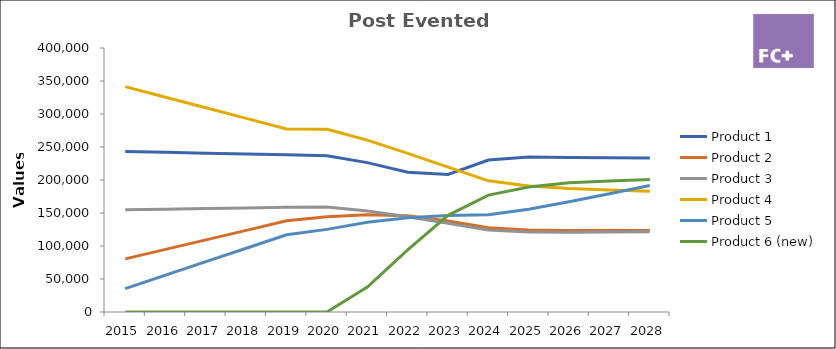
| Category | Product 1 | Product 2 | Product 3 | Product 4 | Product 5 | Product 6 (new) |
|---|---|---|---|---|---|---|
| 2015.0 | 243125 | 80451 | 154784 | 341524 | 35485 | 0 |
| 2016.0 | 241864 | 94875 | 155748 | 325475 | 55874 | 0 |
| 2017.0 | 240603 | 109299 | 156712 | 309426 | 76263 | 0 |
| 2018.0 | 239342 | 123723 | 157676 | 293377 | 96652 | 0 |
| 2019.0 | 238081 | 138147 | 158640 | 277328 | 117041 | 0 |
| 2020.0 | 236820 | 144330.058 | 159020.736 | 277003.434 | 125196.6 | 0 |
| 2021.0 | 226306.68 | 147514.199 | 153141.356 | 260367.682 | 135949.636 | 37747.352 |
| 2022.0 | 211791.047 | 145786.176 | 144435.813 | 240287.728 | 142658.713 | 94044.303 |
| 2023.0 | 208298.095 | 137939.763 | 134508.386 | 219392.245 | 146233.383 | 146463.692 |
| 2024.0 | 230157.242 | 127549.174 | 124111.407 | 198784.077 | 147216.02 | 177103.125 |
| 2025.0 | 235008.915 | 124308.805 | 121248.674 | 190943.363 | 155764.659 | 189378.037 |
| 2026.0 | 234190.877 | 123536.352 | 120784.424 | 187225.026 | 167009.018 | 195961.614 |
| 2027.0 | 233801.97 | 123566.089 | 121103.452 | 184940.489 | 179264.44 | 198357.486 |
| 2028.0 | 233424.642 | 123595.279 | 121422.777 | 182826.79 | 191524.893 | 200797.734 |